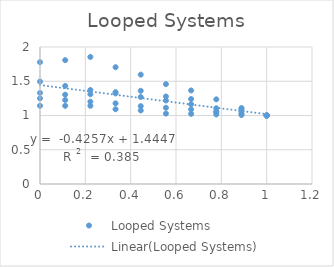
| Category | Looped Systems |
|---|---|
| 1.0 | 1 |
| 0.8888888888888888 | 1.008 |
| 0.7777777777777778 | 1.016 |
| 0.6666666666666666 | 1.023 |
| 0.5555555555555556 | 1.028 |
| 0.4444444444444444 | 1.073 |
| 0.3333333333333333 | 1.092 |
| 0.2222222222222222 | 1.142 |
| 0.1111111111111111 | 1.142 |
| 0.0 | 1.141 |
| 1.0 | 1 |
| 0.8888888888888888 | 1.109 |
| 0.7777777777777778 | 1.236 |
| 0.6666666666666666 | 1.366 |
| 0.5555555555555556 | 1.458 |
| 0.4444444444444444 | 1.596 |
| 0.3333333333333333 | 1.705 |
| 0.2222222222222222 | 1.855 |
| 0.1111111111111111 | 1.808 |
| 0.0 | 1.779 |
| 1.0 | 1 |
| 0.8888888888888888 | 1.058 |
| 0.7777777777777778 | 1.106 |
| 0.6666666666666666 | 1.164 |
| 0.5555555555555556 | 1.22 |
| 0.4444444444444444 | 1.269 |
| 0.3333333333333333 | 1.323 |
| 0.2222222222222222 | 1.372 |
| 0.1111111111111111 | 1.432 |
| 0.0 | 1.495 |
| 1.0 | 1 |
| 0.8888888888888888 | 1.089 |
| 0.7777777777777778 | 1.05 |
| 0.6666666666666666 | 1.24 |
| 0.5555555555555556 | 1.277 |
| 0.4444444444444444 | 1.361 |
| 0.3333333333333333 | 1.341 |
| 0.2222222222222222 | 1.31 |
| 0.1111111111111111 | 1.304 |
| 0.0 | 1.33 |
| 1.0 | 1 |
| 0.8888888888888888 | 1.024 |
| 0.7777777777777778 | 1.056 |
| 0.6666666666666666 | 1.089 |
| 0.5555555555555556 | 1.113 |
| 0.4444444444444444 | 1.137 |
| 0.3333333333333333 | 1.177 |
| 0.2222222222222222 | 1.202 |
| 0.1111111111111111 | 1.226 |
| 0.0 | 1.25 |